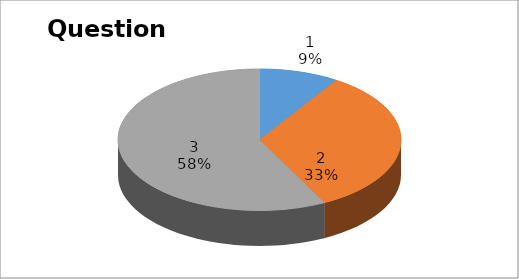
| Category | Series 0 |
|---|---|
| 0 | 3 |
| 1 | 11 |
| 2 | 19 |